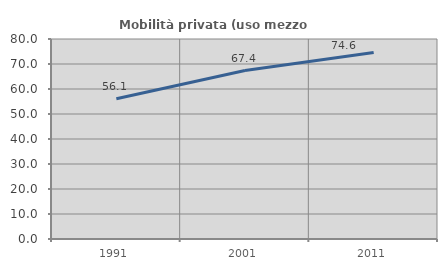
| Category | Mobilità privata (uso mezzo privato) |
|---|---|
| 1991.0 | 56.122 |
| 2001.0 | 67.39 |
| 2011.0 | 74.631 |